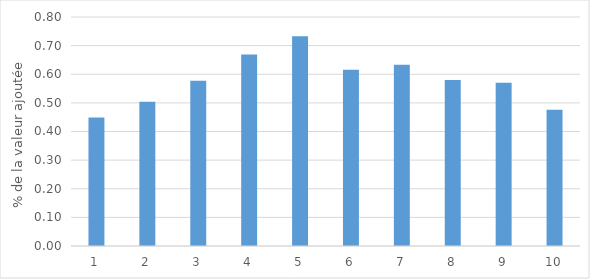
| Category | baisse_cet_tot_ova |
|---|---|
| 1.0 | 0.449 |
| 2.0 | 0.504 |
| 3.0 | 0.577 |
| 4.0 | 0.669 |
| 5.0 | 0.732 |
| 6.0 | 0.615 |
| 7.0 | 0.633 |
| 8.0 | 0.58 |
| 9.0 | 0.57 |
| 10.0 | 0.476 |